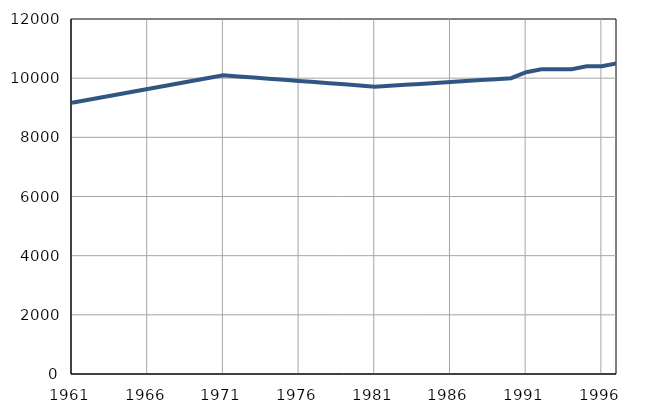
| Category | Population
size |
|---|---|
| 1961.0 | 9166 |
| 1962.0 | 9259 |
| 1963.0 | 9352 |
| 1964.0 | 9445 |
| 1965.0 | 9538 |
| 1966.0 | 9631 |
| 1967.0 | 9724 |
| 1968.0 | 9817 |
| 1969.0 | 9910 |
| 1970.0 | 10003 |
| 1971.0 | 10095 |
| 1972.0 | 10057 |
| 1973.0 | 10019 |
| 1974.0 | 9981 |
| 1975.0 | 9943 |
| 1976.0 | 9905 |
| 1977.0 | 9867 |
| 1978.0 | 9829 |
| 1979.0 | 9791 |
| 1980.0 | 9753 |
| 1981.0 | 9710 |
| 1982.0 | 9742 |
| 1983.0 | 9774 |
| 1984.0 | 9806 |
| 1985.0 | 9838 |
| 1986.0 | 9870 |
| 1987.0 | 9902 |
| 1988.0 | 9934 |
| 1989.0 | 9966 |
| 1990.0 | 9998 |
| 1991.0 | 10200 |
| 1992.0 | 10300 |
| 1993.0 | 10300 |
| 1994.0 | 10300 |
| 1995.0 | 10400 |
| 1996.0 | 10400 |
| 1997.0 | 10500 |